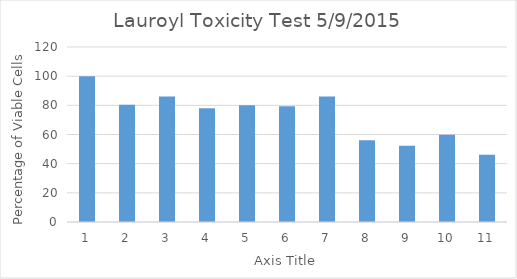
| Category | Series 0 |
|---|---|
| 0 | 100 |
| 1 | 80.359 |
| 2 | 86.009 |
| 3 | 78.022 |
| 4 | 80.016 |
| 5 | 79.374 |
| 6 | 86.005 |
| 7 | 55.976 |
| 8 | 52.292 |
| 9 | 59.838 |
| 10 | 46.076 |